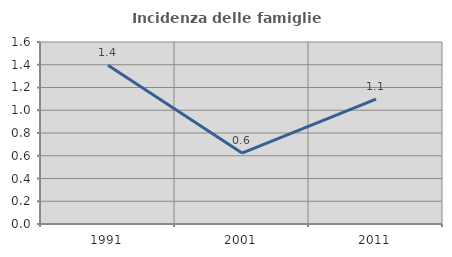
| Category | Incidenza delle famiglie numerose |
|---|---|
| 1991.0 | 1.395 |
| 2001.0 | 0.624 |
| 2011.0 | 1.097 |